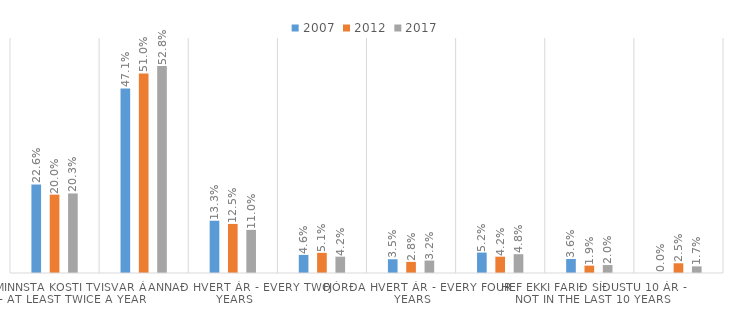
| Category | 2007 | 2012 | 2017 |
|---|---|---|---|
| Að minnsta kosti tvisvar á ári - At least twice a year | 0.226 | 0.2 | 0.203 |
| Einu sinni á ári - Once a year | 0.471 | 0.51 | 0.528 |
| Annað hvert ár - Every two years | 0.133 | 0.125 | 0.11 |
| Þriðja hvert ár - Every three years | 0.046 | 0.051 | 0.042 |
| Fjórða hvert ár - Every four years | 0.035 | 0.028 | 0.032 |
| Hef ekki farið síðustu 5–9 ár - Not in the last 5-9 years | 0.052 | 0.042 | 0.048 |
| Hef ekki farið síðustu 10 ár - Not in the last 10 years | 0.036 | 0.019 | 0.02 |
| Aldrei - Never | 0 | 0.025 | 0.017 |